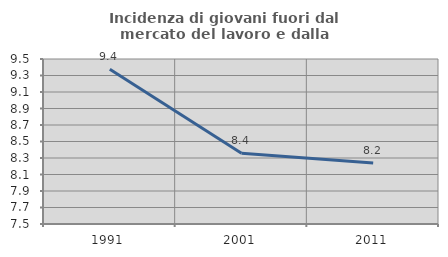
| Category | Incidenza di giovani fuori dal mercato del lavoro e dalla formazione  |
|---|---|
| 1991.0 | 9.375 |
| 2001.0 | 8.357 |
| 2011.0 | 8.239 |